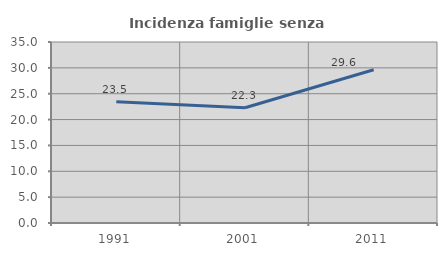
| Category | Incidenza famiglie senza nuclei |
|---|---|
| 1991.0 | 23.469 |
| 2001.0 | 22.277 |
| 2011.0 | 29.63 |